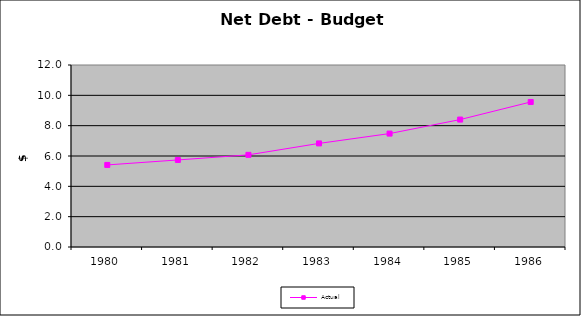
| Category | Actual |
|---|---|
| 1980.0 | 5411 |
| 1981.0 | 5740 |
| 1982.0 | 6076 |
| 1983.0 | 6830 |
| 1984.0 | 7478 |
| 1985.0 | 8402 |
| 1986.0 | 9562 |